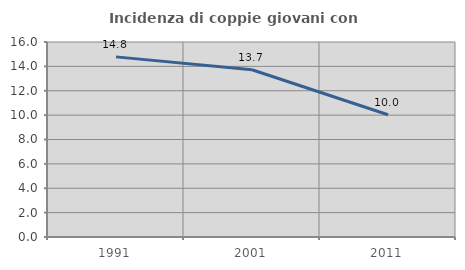
| Category | Incidenza di coppie giovani con figli |
|---|---|
| 1991.0 | 14.779 |
| 2001.0 | 13.721 |
| 2011.0 | 10.033 |